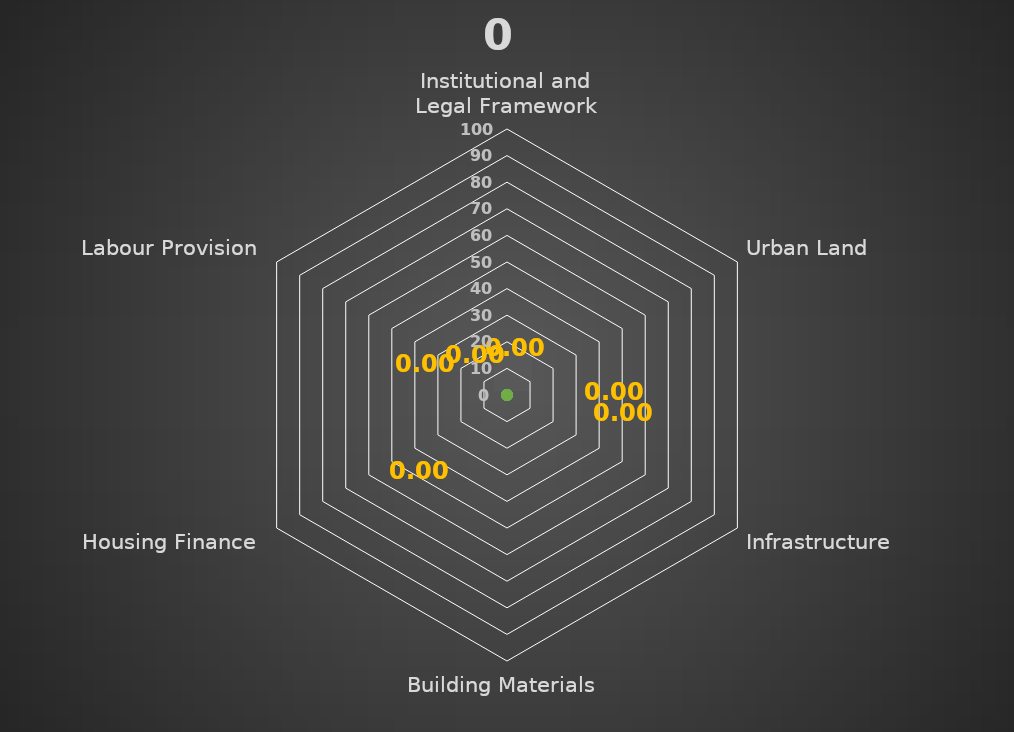
| Category | Series 0 |
|---|---|
| Institutional and Legal Framework | 0 |
| Urban Land | 0 |
| Infrastructure | 0 |
| Building Materials | 0 |
| Housing Finance | 0 |
| Labour Provision | 0 |